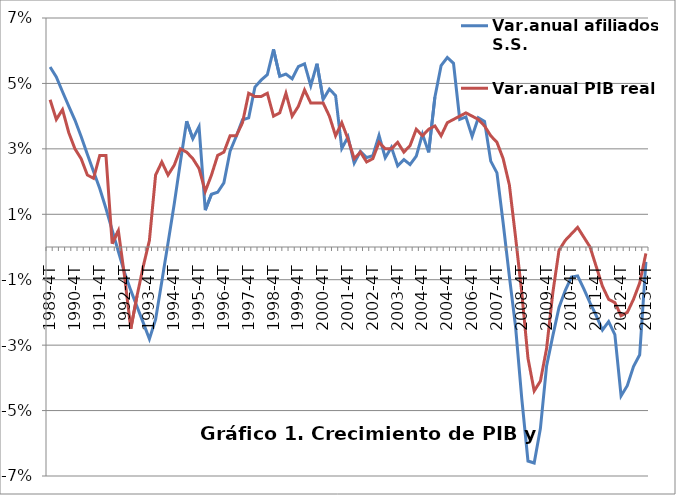
| Category | Var.anual afiliados S.S. | Var.anual PIB real |
|---|---|---|
| 1989-4T | 0.055 | 0.045 |
| 1990-1T | 0.052 | 0.039 |
| 1990-2T | 0.047 | 0.042 |
| 1990-3T | 0.043 | 0.035 |
| 1990-4T | 0.039 | 0.03 |
| 1991-1T | 0.034 | 0.027 |
| 1991-2T | 0.028 | 0.022 |
| 1991-3T | 0.023 | 0.021 |
| 1991-4T | 0.018 | 0.028 |
| 1992-1T | 0.012 | 0.028 |
| 1992-2T | 0.005 | 0.001 |
| 1992-3T | -0.001 | 0.005 |
| 1992-4T | -0.008 | -0.009 |
| 1993-1T | -0.013 | -0.025 |
| 1993-2T | -0.018 | -0.015 |
| 1993-3T | -0.023 | -0.006 |
| 1993-4T | -0.028 | 0.002 |
| 1994-1T | -0.022 | 0.022 |
| 1994-2T | -0.011 | 0.026 |
| 1994-3T | 0.001 | 0.022 |
| 1994-4T | 0.013 | 0.025 |
| 1995-1T | 0.026 | 0.03 |
| 1995-2T | 0.038 | 0.029 |
| 1995-3T | 0.033 | 0.027 |
| 1995-4T | 0.037 | 0.024 |
| 1996-1T | 0.011 | 0.017 |
| 1996-2T | 0.016 | 0.022 |
| 1996-3T | 0.017 | 0.028 |
| 1996-4T | 0.02 | 0.029 |
| 1997-1T | 0.029 | 0.034 |
| 1997-2T | 0.034 | 0.034 |
| 1997-3T | 0.039 | 0.038 |
| 1997-4T | 0.039 | 0.047 |
| 1998-1T | 0.049 | 0.046 |
| 1998-2T | 0.051 | 0.046 |
| 1998-3T | 0.053 | 0.047 |
| 1998-4T | 0.06 | 0.04 |
| 1999-1T | 0.052 | 0.041 |
| 1999-2T | 0.053 | 0.047 |
| 1999-3T | 0.051 | 0.04 |
| 1999-4T | 0.055 | 0.043 |
| 2000-1T | 0.056 | 0.048 |
| 2000-2T | 0.049 | 0.044 |
| 2000-3T | 0.056 | 0.044 |
| 2000-4T | 0.045 | 0.044 |
| 2001-1T | 0.048 | 0.04 |
| 2001-2T | 0.046 | 0.034 |
| 2001-3T | 0.03 | 0.038 |
| 2001-4T | 0.034 | 0.033 |
| 2002-1T | 0.026 | 0.027 |
| 2002-2T | 0.029 | 0.029 |
| 2002-3T | 0.027 | 0.026 |
| 2002-4T | 0.028 | 0.027 |
| 2003-1T | 0.034 | 0.032 |
| 2003-2T | 0.027 | 0.03 |
| 2003-3T | 0.03 | 0.03 |
| 2003-4T | 0.025 | 0.032 |
| 2004-1T | 0.027 | 0.029 |
| 2004-2T | 0.025 | 0.031 |
| 2004-3T | 0.028 | 0.036 |
| 2004-4T | 0.035 | 0.034 |
| 2004-1T | 0.029 | 0.036 |
| 2004-2T | 0.046 | 0.037 |
| 2004-3T | 0.055 | 0.034 |
| 2004-4T | 0.058 | 0.038 |
| 2006-1T | 0.056 | 0.039 |
| 2006-2T | 0.039 | 0.04 |
| 2006-3T | 0.04 | 0.041 |
| 2006-4T | 0.034 | 0.04 |
| 2007-1T | 0.039 | 0.039 |
| 2007-2T | 0.038 | 0.037 |
| 2007-3T | 0.026 | 0.034 |
| 2007-4T | 0.023 | 0.032 |
| 2008-1T | 0.007 | 0.027 |
| 2008-2T | -0.009 | 0.019 |
| 2008-3T | -0.024 | 0.003 |
| 2008-4T | -0.046 | -0.014 |
| 2009-1T | -0.065 | -0.034 |
| 2009-2T | -0.066 | -0.044 |
| 2009-3T | -0.055 | -0.041 |
| 2009-4T | -0.036 | -0.031 |
| 2010-1T | -0.027 | -0.014 |
| 2010-2T | -0.018 | -0.001 |
| 2010-3T | -0.013 | 0.002 |
| 2010-4T | -0.009 | 0.004 |
| 2011-1T | -0.009 | 0.006 |
| 2011-2T | -0.013 | 0.003 |
| 2011-3T | -0.017 | 0 |
| 2011-4T | -0.021 | -0.006 |
| 2012-1T | -0.025 | -0.012 |
| 2012-2T | -0.023 | -0.016 |
| 2012-3T | -0.027 | -0.017 |
| 2012-4T | -0.046 | -0.021 |
| 2013-1T | -0.042 | -0.02 |
| 2013-2T | -0.037 | -0.016 |
| 2013-3T | -0.033 | -0.011 |
| 2013-4T | -0.005 | -0.002 |